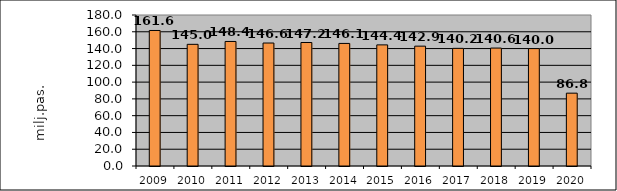
| Category | Series 1 |
|---|---|
| 2009.0 | 161.559 |
| 2010.0 | 145.021 |
| 2011.0 | 148.448 |
| 2012.0 | 146.587 |
| 2013.0 | 147.216 |
| 2014.0 | 146.114 |
| 2015.0 | 144.374 |
| 2016.0 | 142.871 |
| 2017.0 | 140.249 |
| 2018.0 | 140.583 |
| 2019.0 | 139.955 |
| 2020.0 | 86.825 |